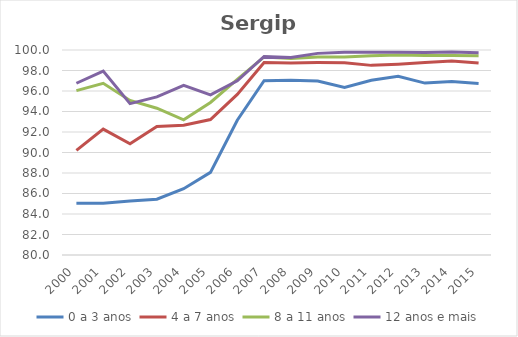
| Category | 0 a 3 anos | 4 a 7 anos | 8 a 11 anos | 12 anos e mais |
|---|---|---|---|---|
| 2000.0 | 85.056 | 90.208 | 96.036 | 96.756 |
| 2001.0 | 85.049 | 92.278 | 96.754 | 97.946 |
| 2002.0 | 85.269 | 90.856 | 95.081 | 94.769 |
| 2003.0 | 85.438 | 92.543 | 94.321 | 95.431 |
| 2004.0 | 86.463 | 92.666 | 93.193 | 96.55 |
| 2005.0 | 88.061 | 93.219 | 94.879 | 95.619 |
| 2006.0 | 93.143 | 95.663 | 97.129 | 97 |
| 2007.0 | 97.002 | 98.772 | 99.321 | 99.372 |
| 2008.0 | 97.055 | 98.739 | 99.165 | 99.276 |
| 2009.0 | 96.981 | 98.779 | 99.314 | 99.671 |
| 2010.0 | 96.347 | 98.761 | 99.328 | 99.789 |
| 2011.0 | 97.054 | 98.5 | 99.44 | 99.792 |
| 2012.0 | 97.426 | 98.617 | 99.506 | 99.778 |
| 2013.0 | 96.77 | 98.782 | 99.465 | 99.765 |
| 2014.0 | 96.916 | 98.938 | 99.455 | 99.804 |
| 2015.0 | 96.73 | 98.743 | 99.441 | 99.743 |